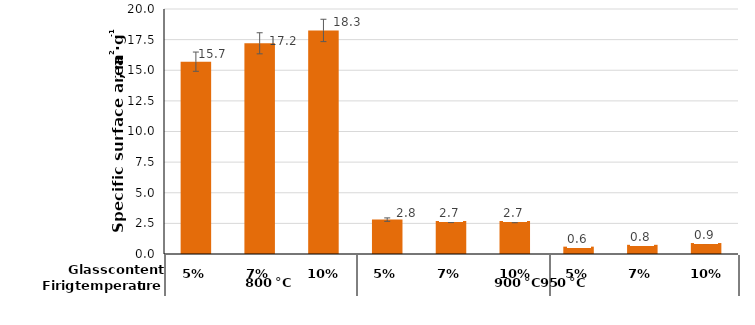
| Category | Series 0 |
|---|---|
| 5% | 15.7 |
| 7% | 17.2 |
| 10% | 18.25 |
| 5% | 2.807 |
| 7% | 2.7 |
| 10% | 2.688 |
| 5% | 0.6 |
| 7% | 0.75 |
| 10% | 0.895 |